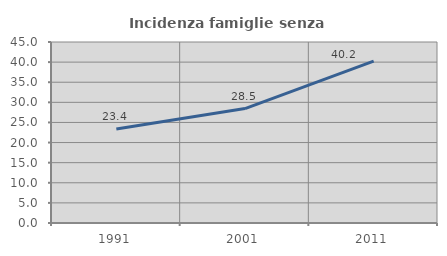
| Category | Incidenza famiglie senza nuclei |
|---|---|
| 1991.0 | 23.356 |
| 2001.0 | 28.458 |
| 2011.0 | 40.247 |